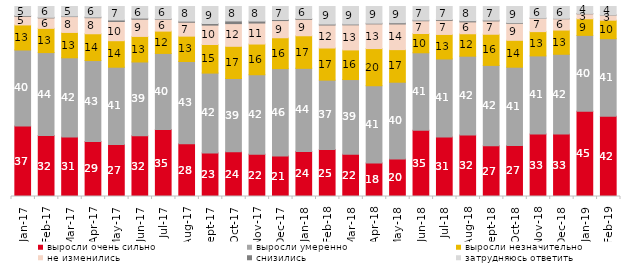
| Category | выросли очень сильно | выросли умеренно | выросли незначительно | не изменились | снизились | затрудняюсь ответить |
|---|---|---|---|---|---|---|
| 2017-01-01 | 37.15 | 39.95 | 13.2 | 4.55 | 0.4 | 4.75 |
| 2017-02-01 | 32.05 | 43.7 | 12.75 | 5.5 | 0.3 | 5.7 |
| 2017-03-01 | 31.3 | 41.7 | 13.35 | 8.35 | 0.25 | 5.05 |
| 2017-04-01 | 28.95 | 42.6 | 14.1 | 8.45 | 0.35 | 5.55 |
| 2017-05-01 | 27.4 | 40.65 | 13.95 | 10.1 | 0.8 | 7.1 |
| 2017-06-01 | 31.95 | 38.85 | 13.45 | 9.05 | 0.6 | 6.1 |
| 2017-07-01 | 35.25 | 40.05 | 11.75 | 6.25 | 0.25 | 6.45 |
| 2017-08-01 | 27.7 | 43.35 | 13.35 | 7.3 | 0.6 | 7.7 |
| 2017-09-01 | 22.95 | 42 | 15.05 | 10.2 | 0.85 | 8.95 |
| 2017-10-01 | 23.6 | 38.5 | 16.95 | 11.95 | 1.4 | 7.6 |
| 2017-11-01 | 22.25 | 41.8 | 16.15 | 11.05 | 1.05 | 7.65 |
| 2017-12-01 | 21.35 | 45.95 | 16.25 | 9.05 | 0.55 | 6.85 |
| 2018-01-01 | 23.75 | 43.7 | 17.15 | 8.65 | 0.45 | 6.3 |
| 2018-02-01 | 24.7 | 36.55 | 16.9 | 12.1 | 0.5 | 9.25 |
| 2018-03-01 | 22.25 | 39.3 | 15.6 | 13.2 | 0.4 | 9.25 |
| 2018-04-01 | 17.65 | 40.65 | 19.55 | 13 | 0.35 | 8.8 |
| 2018-05-01 | 19.75 | 40.4 | 17.15 | 13.5 | 0.65 | 8.55 |
| 2018-06-01 | 34.85 | 40.8 | 10.15 | 6.7 | 0.35 | 7.15 |
| 2018-07-01 | 31.3 | 41.05 | 12.9 | 7.4 | 0.45 | 6.85 |
| 2018-08-01 | 32.35 | 41.5 | 11.8 | 6.25 | 0.6 | 7.5 |
| 2018-09-01 | 26.7 | 42.3 | 16.4 | 7 | 0.45 | 7.15 |
| 2018-10-01 | 26.9 | 41.15 | 14.15 | 8.9 | 0.35 | 8.55 |
| 2018-11-01 | 32.934 | 41.068 | 12.774 | 7.036 | 0.1 | 6.088 |
| 2018-12-01 | 32.85 | 42 | 12.75 | 5.95 | 0.2 | 6.25 |
| 2019-01-01 | 44.85 | 39.95 | 8.75 | 2.6 | 0.2 | 3.65 |
| 2019-02-01 | 42.2 | 40.85 | 9.75 | 2.7 | 0.1 | 4.4 |